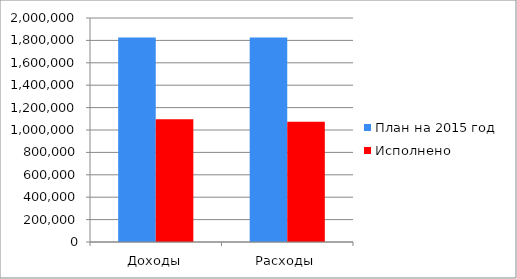
| Category | План на 2015 год | Исполнено  |
|---|---|---|
| Доходы | 1826128 | 1094938 |
| Расходы | 1826276 | 1074474 |